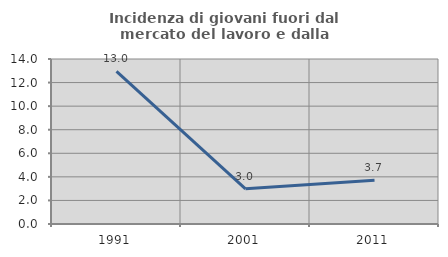
| Category | Incidenza di giovani fuori dal mercato del lavoro e dalla formazione  |
|---|---|
| 1991.0 | 12.953 |
| 2001.0 | 2.985 |
| 2011.0 | 3.704 |